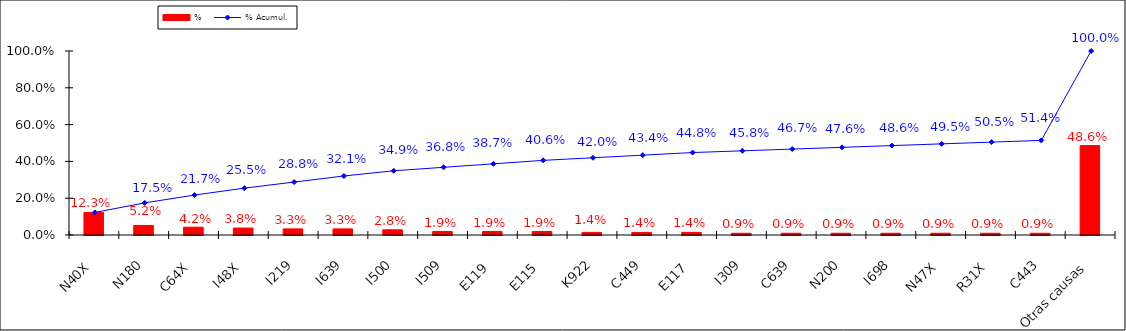
| Category | % |
|---|---|
| N40X | 0.123 |
| N180 | 0.052 |
| C64X | 0.042 |
| I48X | 0.038 |
| I219 | 0.033 |
| I639 | 0.033 |
| I500 | 0.028 |
| I509 | 0.019 |
| E119 | 0.019 |
| E115 | 0.019 |
| K922 | 0.014 |
| C449 | 0.014 |
| E117 | 0.014 |
| I309 | 0.009 |
| C639 | 0.009 |
| N200 | 0.009 |
| I698 | 0.009 |
| N47X | 0.009 |
| R31X | 0.009 |
| C443 | 0.009 |
| Otras causas | 0.486 |